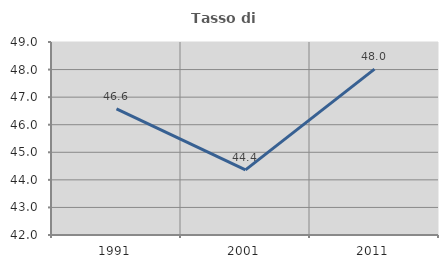
| Category | Tasso di occupazione   |
|---|---|
| 1991.0 | 46.577 |
| 2001.0 | 44.363 |
| 2011.0 | 48.016 |